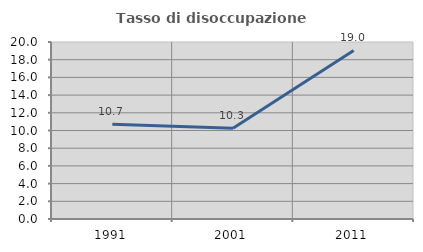
| Category | Tasso di disoccupazione giovanile  |
|---|---|
| 1991.0 | 10.714 |
| 2001.0 | 10.256 |
| 2011.0 | 19.048 |